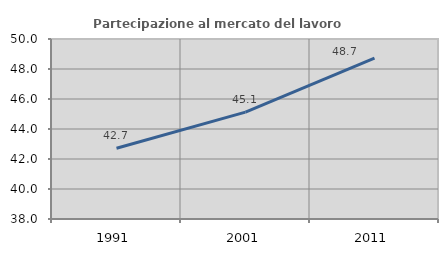
| Category | Partecipazione al mercato del lavoro  femminile |
|---|---|
| 1991.0 | 42.72 |
| 2001.0 | 45.122 |
| 2011.0 | 48.72 |